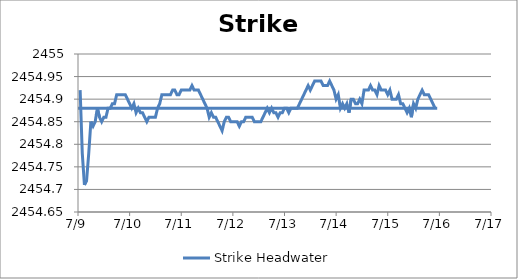
| Category | Strike Headwater |
|---|---|
| 37811.041276331016 | 2454.92 |
| 37811.082942939815 | 2454.78 |
| 37811.12460954861 | 2454.71 |
| 37811.166276157404 | 2454.72 |
| 37811.2079427662 | 2454.78 |
| 37811.249609375 | 2454.85 |
| 37811.29127598379 | 2454.84 |
| 37811.33294259259 | 2454.85 |
| 37811.37460920139 | 2454.88 |
| 37811.41627581019 | 2454.86 |
| 37811.45794241898 | 2454.85 |
| 37811.49960902778 | 2454.86 |
| 37811.54127563658 | 2454.86 |
| 37811.58294224537 | 2454.88 |
| 37811.62460885417 | 2454.88 |
| 37811.666275462965 | 2454.89 |
| 37811.70794207176 | 2454.89 |
| 37811.749608680555 | 2454.91 |
| 37811.79127528935 | 2454.91 |
| 37811.832941898145 | 2454.91 |
| 37811.87460850694 | 2454.91 |
| 37811.91627511574 | 2454.91 |
| 37811.95794172454 | 2454.9 |
| 37811.99960833333 | 2454.89 |
| 37812.04127494213 | 2454.88 |
| 37812.08294155093 | 2454.89 |
| 37812.12460815972 | 2454.87 |
| 37812.16627476852 | 2454.88 |
| 37812.20794137732 | 2454.87 |
| 37812.24960798611 | 2454.87 |
| 37812.29127459491 | 2454.86 |
| 37812.332941203706 | 2454.85 |
| 37812.3746078125 | 2454.86 |
| 37812.416274421295 | 2454.86 |
| 37812.457941030094 | 2454.86 |
| 37812.49960763889 | 2454.86 |
| 37812.541274247684 | 2454.88 |
| 37812.58294085648 | 2454.89 |
| 37812.62460746528 | 2454.91 |
| 37812.66627407407 | 2454.91 |
| 37812.70794068287 | 2454.91 |
| 37812.74960729167 | 2454.91 |
| 37812.79127390046 | 2454.91 |
| 37812.83294050926 | 2454.92 |
| 37812.87460711806 | 2454.92 |
| 37812.91627372685 | 2454.91 |
| 37812.95794033565 | 2454.91 |
| 37812.999606944446 | 2454.92 |
| 37813.04127355324 | 2454.92 |
| 37813.082940162036 | 2454.92 |
| 37813.124606770834 | 2454.92 |
| 37813.16627337963 | 2454.92 |
| 37813.207939988424 | 2454.93 |
| 37813.24960659722 | 2454.92 |
| 37813.29127320602 | 2454.92 |
| 37813.33293981481 | 2454.92 |
| 37813.37460642361 | 2454.91 |
| 37813.41627303241 | 2454.9 |
| 37813.4579396412 | 2454.89 |
| 37813.49960625 | 2454.88 |
| 37813.5412728588 | 2454.86 |
| 37813.58293946759 | 2454.87 |
| 37813.62460607639 | 2454.86 |
| 37813.66627268519 | 2454.86 |
| 37813.707939293985 | 2454.85 |
| 37813.749605902776 | 2454.84 |
| 37813.791272511575 | 2454.83 |
| 37813.83293912037 | 2454.85 |
| 37813.874605729165 | 2454.86 |
| 37813.91627233796 | 2454.86 |
| 37813.95793894676 | 2454.85 |
| 37813.99960555555 | 2454.85 |
| 37814.04127216435 | 2454.85 |
| 37814.08293877315 | 2454.85 |
| 37814.12460538194 | 2454.84 |
| 37814.16627199074 | 2454.85 |
| 37814.20793859954 | 2454.85 |
| 37814.24960520833 | 2454.86 |
| 37814.29127181713 | 2454.86 |
| 37814.33293842593 | 2454.86 |
| 37814.374605034725 | 2454.86 |
| 37814.41627164352 | 2454.85 |
| 37814.457938252315 | 2454.85 |
| 37814.499604861114 | 2454.85 |
| 37814.541271469905 | 2454.85 |
| 37814.5829380787 | 2454.86 |
| 37814.6246046875 | 2454.87 |
| 37814.66627129629 | 2454.88 |
| 37814.70793790509 | 2454.87 |
| 37814.74960451389 | 2454.88 |
| 37814.79127112268 | 2454.87 |
| 37814.83293773148 | 2454.87 |
| 37814.87460434028 | 2454.86 |
| 37814.91627094908 | 2454.87 |
| 37814.95793755787 | 2454.87 |
| 37814.99960416667 | 2454.88 |
| 37815.041270775466 | 2454.88 |
| 37815.08293738426 | 2454.87 |
| 37815.124603993056 | 2454.88 |
| 37815.166270601854 | 2454.88 |
| 37815.207937210645 | 2454.88 |
| 37815.249603819444 | 2454.88 |
| 37815.29127042824 | 2454.89 |
| 37815.332937037034 | 2454.9 |
| 37815.37460364583 | 2454.91 |
| 37815.41627025463 | 2454.92 |
| 37815.45793686343 | 2454.93 |
| 37815.49960347222 | 2454.92 |
| 37815.54127008102 | 2454.93 |
| 37815.58293668982 | 2454.94 |
| 37815.62460329861 | 2454.94 |
| 37815.66626990741 | 2454.94 |
| 37815.707936516206 | 2454.94 |
| 37815.749603125 | 2454.93 |
| 37815.791269733796 | 2454.93 |
| 37815.832936342595 | 2454.93 |
| 37815.874602951386 | 2454.94 |
| 37815.916269560184 | 2454.93 |
| 37815.95793616898 | 2454.92 |
| 37815.999602777774 | 2454.9 |
| 37816.04126938657 | 2454.91 |
| 37816.08293599537 | 2454.88 |
| 37816.12460260417 | 2454.89 |
| 37816.16626921296 | 2454.88 |
| 37816.20793582176 | 2454.89 |
| 37816.24960243056 | 2454.87 |
| 37816.29126903935 | 2454.9 |
| 37816.33293564815 | 2454.9 |
| 37816.37460225695 | 2454.89 |
| 37816.41626886574 | 2454.89 |
| 37816.45793547454 | 2454.9 |
| 37816.499602083335 | 2454.89 |
| 37816.541268692126 | 2454.92 |
| 37816.582935300925 | 2454.92 |
| 37816.62460190972 | 2454.92 |
| 37816.66626851852 | 2454.93 |
| 37816.70793512731 | 2454.92 |
| 37816.74960173611 | 2454.92 |
| 37816.79126834491 | 2454.91 |
| 37816.8329349537 | 2454.93 |
| 37816.8746015625 | 2454.92 |
| 37816.9162681713 | 2454.92 |
| 37816.95793478009 | 2454.92 |
| 37816.99960138889 | 2454.91 |
| 37817.04126799769 | 2454.92 |
| 37817.08293460648 | 2454.9 |
| 37817.12460121528 | 2454.9 |
| 37817.166267824075 | 2454.9 |
| 37817.20793443287 | 2454.91 |
| 37817.249601041665 | 2454.89 |
| 37817.291267650464 | 2454.89 |
| 37817.33293425926 | 2454.88 |
| 37817.374600868054 | 2454.87 |
| 37817.41626747685 | 2454.88 |
| 37817.45793408565 | 2454.86 |
| 37817.49960069444 | 2454.89 |
| 37817.54126730324 | 2454.88 |
| 37817.58293391204 | 2454.9 |
| 37817.62460052083 | 2454.91 |
| 37817.66626712963 | 2454.92 |
| 37817.70793373843 | 2454.91 |
| 37817.74960034722 | 2454.91 |
| 37817.79126695602 | 2454.91 |
| 37817.832933564816 | 2454.9 |
| 37817.874600173614 | 2454.89 |
| 37817.916266782406 | 2454.88 |
| 37817.957933391204 | 2454.88 |